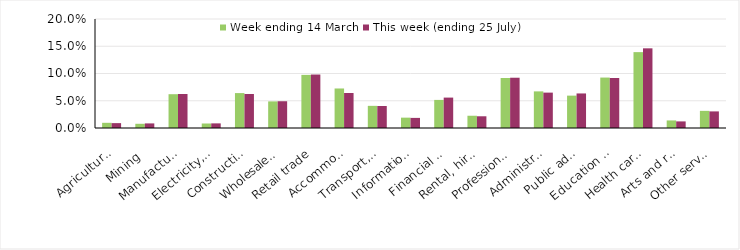
| Category | Week ending 14 March | This week (ending 25 July) |
|---|---|---|
| Agriculture, forestry and fishing | 0.01 | 0.009 |
| Mining | 0.008 | 0.008 |
| Manufacturing | 0.062 | 0.062 |
| Electricity, gas, water and waste services | 0.008 | 0.008 |
| Construction | 0.064 | 0.062 |
| Wholesale trade | 0.049 | 0.049 |
| Retail trade | 0.097 | 0.098 |
| Accommodation and food services | 0.073 | 0.064 |
| Transport, postal and warehousing | 0.041 | 0.04 |
| Information media and telecommunications | 0.019 | 0.019 |
| Financial and insurance services | 0.052 | 0.056 |
| Rental, hiring and real estate services | 0.022 | 0.022 |
| Professional, scientific and technical services | 0.092 | 0.092 |
| Administrative and support services | 0.067 | 0.065 |
| Public administration and safety | 0.059 | 0.063 |
| Education and training | 0.093 | 0.092 |
| Health care and social assistance | 0.139 | 0.146 |
| Arts and recreation services | 0.014 | 0.012 |
| Other services | 0.031 | 0.03 |